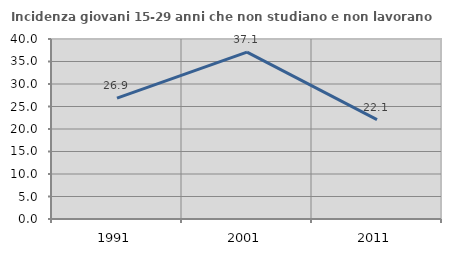
| Category | Incidenza giovani 15-29 anni che non studiano e non lavorano  |
|---|---|
| 1991.0 | 26.85 |
| 2001.0 | 37.087 |
| 2011.0 | 22.091 |